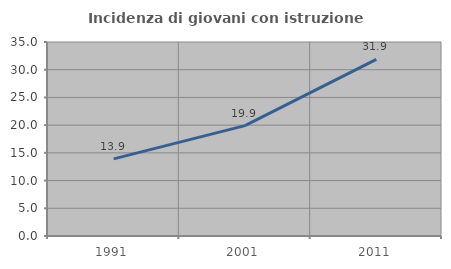
| Category | Incidenza di giovani con istruzione universitaria |
|---|---|
| 1991.0 | 13.914 |
| 2001.0 | 19.908 |
| 2011.0 | 31.867 |